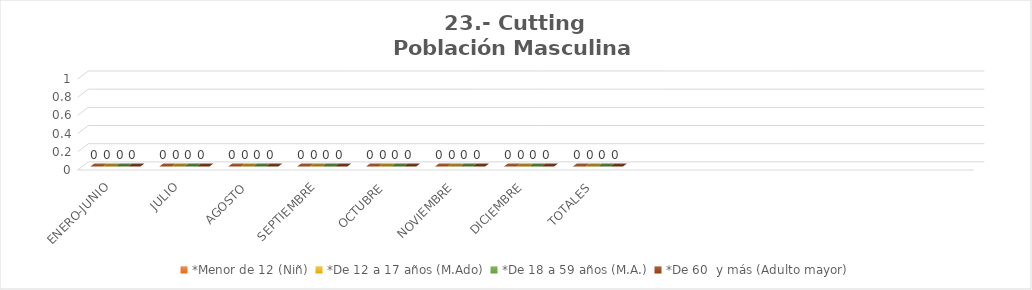
| Category | *Menor de 12 (Niñ) | *De 12 a 17 años (M.Ado) | *De 18 a 59 años (M.A.) | *De 60  y más (Adulto mayor) |
|---|---|---|---|---|
| ENERO-JUNIO | 0 | 0 | 0 | 0 |
| JULIO | 0 | 0 | 0 | 0 |
| AGOSTO | 0 | 0 | 0 | 0 |
| SEPTIEMBRE | 0 | 0 | 0 | 0 |
| OCTUBRE | 0 | 0 | 0 | 0 |
| NOVIEMBRE | 0 | 0 | 0 | 0 |
| DICIEMBRE | 0 | 0 | 0 | 0 |
| TOTALES | 0 | 0 | 0 | 0 |